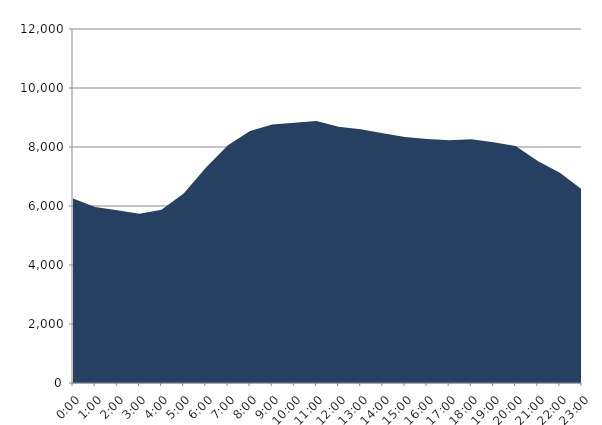
| Category | Series 0 | Series 1 |
|---|---|---|
| 2020-08-19 |  | 6254.167 |
| 2020-08-19 01:00:00 |  | 5963.337 |
| 2020-08-19 02:00:00 |  | 5856.516 |
| 2020-08-19 03:00:00 |  | 5739.455 |
| 2020-08-19 04:00:00 |  | 5869.55 |
| 2020-08-19 05:00:00 |  | 6427.207 |
| 2020-08-19 06:00:00 |  | 7295.572 |
| 2020-08-19 07:00:00 |  | 8059.591 |
| 2020-08-19 08:00:00 |  | 8545.865 |
| 2020-08-19 09:00:00 |  | 8760.597 |
| 2020-08-19 10:00:00 |  | 8824.034 |
| 2020-08-19 11:00:00 |  | 8883.082 |
| 2020-08-19 12:00:00 |  | 8686.77 |
| 2020-08-19 13:00:00 |  | 8605.228 |
| 2020-08-19 14:00:00 |  | 8464.33 |
| 2020-08-19 15:00:00 |  | 8338.684 |
| 2020-08-19 16:00:00 |  | 8273.794 |
| 2020-08-19 17:00:00 |  | 8229.188 |
| 2020-08-19 18:00:00 |  | 8260.337 |
| 2020-08-19 19:00:00 |  | 8163.568 |
| 2020-08-19 20:00:00 |  | 8037.282 |
| 2020-08-19 21:00:00 |  | 7526.314 |
| 2020-08-19 22:00:00 |  | 7130.29 |
| 2020-08-19 23:00:00 |  | 6562.017 |